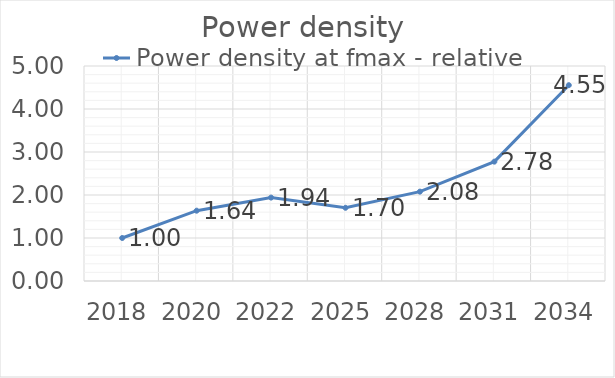
| Category | Power density at fmax - relative |
|---|---|
| 2018.0 | 1 |
| 2020.0 | 1.635 |
| 2022.0 | 1.939 |
| 2025.0 | 1.703 |
| 2028.0 | 2.078 |
| 2031.0 | 2.776 |
| 2034.0 | 4.554 |